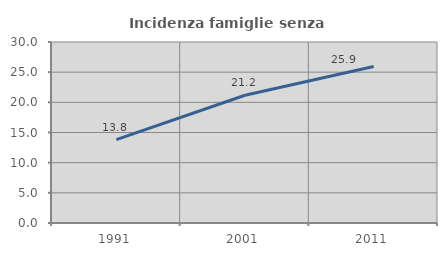
| Category | Incidenza famiglie senza nuclei |
|---|---|
| 1991.0 | 13.817 |
| 2001.0 | 21.168 |
| 2011.0 | 25.935 |